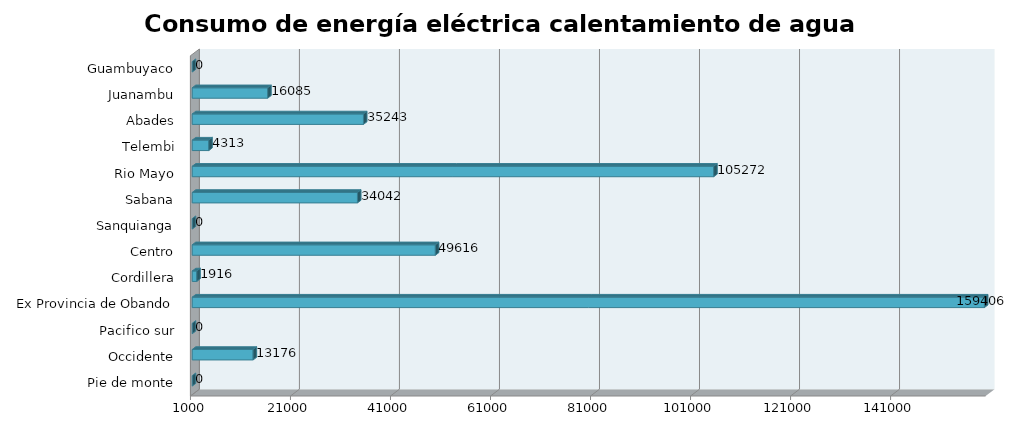
| Category | Series 0 |
|---|---|
| Pie de monte | 0 |
| Occidente | 13175.735 |
| Pacifico sur | 0 |
| Ex Provincia de Obando | 159405.88 |
| Cordillera | 1916.186 |
| Centro | 49615.683 |
| Sanquianga | 0 |
| Sabana | 34042.055 |
| Rio Mayo | 105272.49 |
| Telembi | 4313.091 |
| Abades | 35242.667 |
| Juanambu | 16084.911 |
| Guambuyaco | 0 |